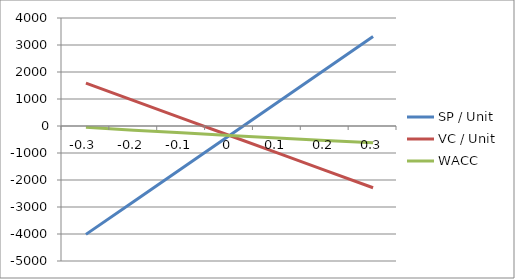
| Category | SP / Unit | VC / Unit | WACC |
|---|---|---|---|
| -30% | -4014 | 1585 | -50 |
| -20% | -2793 | 940 | -154 |
| -10% | -1572 | 294 | -254 |
| 0% | -351 | -351 | -351 |
| 10% | 870 | -996 | -443 |
| 20% | 2091 | -1641 | -533 |
| 30% | 3312 | -2286 | -619 |